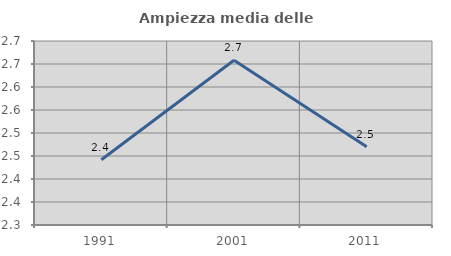
| Category | Ampiezza media delle famiglie |
|---|---|
| 1991.0 | 2.442 |
| 2001.0 | 2.658 |
| 2011.0 | 2.47 |